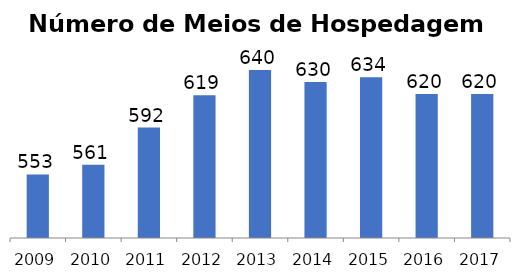
| Category | Meios de Hospedagem |
|---|---|
| 2009.0 | 553 |
| 2010.0 | 561 |
| 2011.0 | 592 |
| 2012.0 | 619 |
| 2013.0 | 640 |
| 2014.0 | 630 |
| 2015.0 | 634 |
| 2016.0 | 620 |
| 2017.0 | 620 |